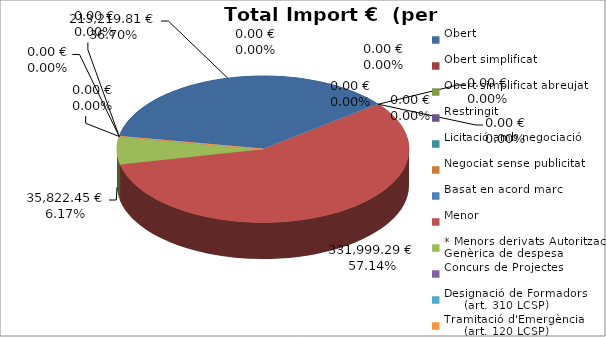
| Category | Total preu
(amb IVA) |
|---|---|
| Obert | 213219.81 |
| Obert simplificat | 0 |
| Obert simplificat abreujat | 0 |
| Restringit | 0 |
| Licitació amb negociació | 0 |
| Negociat sense publicitat | 0 |
| Basat en acord marc | 0 |
| Menor | 331999.29 |
| * Menors derivats Autorització Genèrica de despesa | 35822.45 |
| Concurs de Projectes | 0 |
| Designació de Formadors
     (art. 310 LCSP) | 0 |
| Tramitació d'Emergència
     (art. 120 LCSP) | 0 |